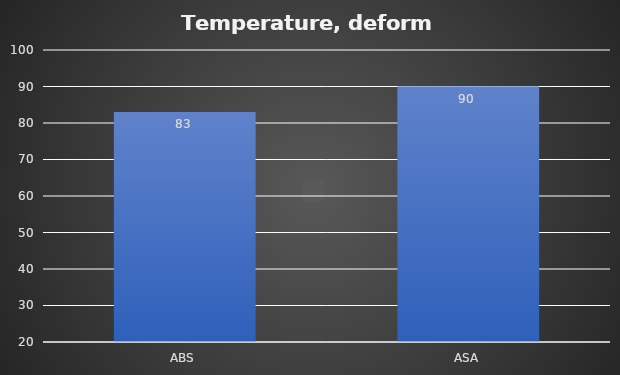
| Category | Deform °C |
|---|---|
| ABS | 83 |
| ASA | 90 |